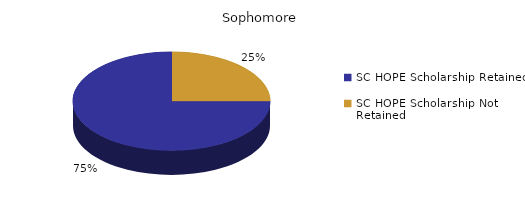
| Category | Sophomore |
|---|---|
| SC HOPE Scholarship Retained  | 6 |
| SC HOPE Scholarship Not Retained  | 2 |